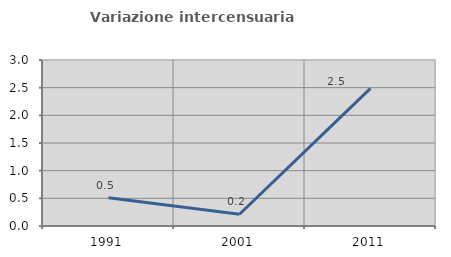
| Category | Variazione intercensuaria annua |
|---|---|
| 1991.0 | 0.51 |
| 2001.0 | 0.213 |
| 2011.0 | 2.488 |